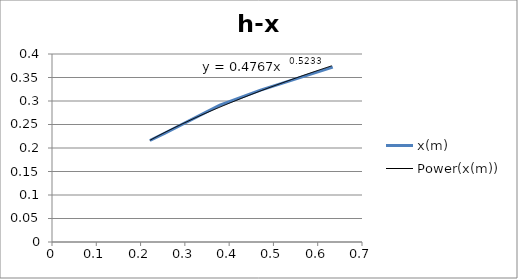
| Category | x(m) |
|---|---|
| 0.221 | 0.216 |
| 0.254 | 0.231 |
| 0.379 | 0.291 |
| 0.471 | 0.323 |
| 0.634 | 0.372 |